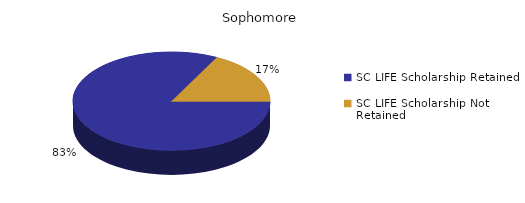
| Category | Sophomore |
|---|---|
| SC LIFE Scholarship Retained  | 1307 |
| SC LIFE Scholarship Not Retained  | 276 |